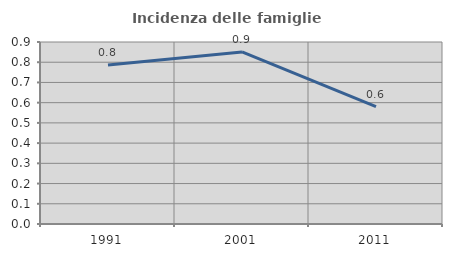
| Category | Incidenza delle famiglie numerose |
|---|---|
| 1991.0 | 0.787 |
| 2001.0 | 0.851 |
| 2011.0 | 0.581 |